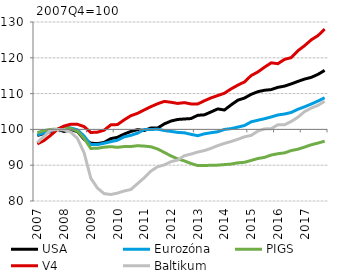
| Category | USA | Eurozóna | PIGS | V4 | Baltikum |
|---|---|---|---|---|---|
| 2007.0 | 98.296 | 98.392 | 99.081 | 95.939 | 96.34 |
| nan | 98.859 | 99.083 | 99.678 | 96.895 | 98.081 |
| nan | 99.396 | 99.501 | 99.994 | 98.356 | 99.793 |
| nan | 100 | 100 | 100.063 | 100 | 100 |
| 2008.0 | 99.425 | 100.726 | 100.748 | 100.945 | 99.835 |
| nan | 99.939 | 100.397 | 100.212 | 101.445 | 99.251 |
| nan | 99.398 | 99.886 | 99.505 | 101.428 | 97.468 |
| nan | 97.247 | 98.131 | 97.465 | 100.775 | 93.475 |
| 2009.0 | 96.155 | 95.757 | 94.685 | 99.133 | 86.37 |
| nan | 96.017 | 95.754 | 94.727 | 99.228 | 83.596 |
| nan | 96.366 | 96.134 | 95.033 | 99.785 | 82.048 |
| nan | 97.425 | 96.573 | 95.185 | 101.266 | 81.821 |
| 2010.0 | 97.8 | 96.975 | 94.987 | 101.352 | 82.211 |
| nan | 98.701 | 97.922 | 95.218 | 102.672 | 82.8 |
| nan | 99.429 | 98.345 | 95.224 | 103.827 | 83.21 |
| nan | 99.928 | 98.949 | 95.449 | 104.484 | 84.856 |
| 2011.0 | 99.688 | 99.958 | 95.337 | 105.452 | 86.483 |
| nan | 100.401 | 99.954 | 95.144 | 106.351 | 88.354 |
| nan | 100.373 | 100.069 | 94.536 | 107.169 | 89.576 |
| nan | 101.536 | 99.693 | 93.564 | 107.814 | 90.075 |
| 2012.0 | 102.331 | 99.44 | 92.59 | 107.586 | 90.987 |
| nan | 102.771 | 99.169 | 91.769 | 107.254 | 91.428 |
| nan | 102.91 | 99.05 | 91.205 | 107.475 | 92.654 |
| nan | 103.027 | 98.622 | 90.472 | 107.116 | 93.108 |
| 2013.0 | 103.94 | 98.241 | 89.89 | 107.1 | 93.672 |
| nan | 104.068 | 98.767 | 89.908 | 107.997 | 94.092 |
| nan | 104.883 | 99.073 | 89.983 | 108.806 | 94.716 |
| nan | 105.721 | 99.347 | 90.021 | 109.451 | 95.474 |
| 2014.0 | 105.422 | 99.991 | 90.168 | 110.108 | 96.088 |
| nan | 106.849 | 100.212 | 90.318 | 111.322 | 96.62 |
| nan | 108.153 | 100.637 | 90.658 | 112.359 | 97.236 |
| nan | 108.762 | 101.083 | 90.81 | 113.263 | 97.932 |
| 2015.0 | 109.794 | 102.113 | 91.327 | 115.042 | 98.318 |
| nan | 110.537 | 102.561 | 91.862 | 116.045 | 99.522 |
| nan | 110.938 | 102.982 | 92.183 | 117.374 | 100.136 |
| nan | 111.116 | 103.477 | 92.844 | 118.592 | 100.2 |
| 2016.0 | 111.745 | 104.038 | 93.208 | 118.358 | 101.315 |
| nan | 112.094 | 104.294 | 93.445 | 119.563 | 101.29 |
| nan | 112.704 | 104.743 | 94.094 | 120.049 | 102.213 |
| nan | 113.413 | 105.623 | 94.466 | 121.981 | 103.411 |
| 2017.0 | 114.055 | 106.314 | 95.063 | 123.395 | 104.982 |
| nan | 114.542 | 107.092 | 95.71 | 125.03 | 105.965 |
| nan | 115.377 | 107.922 | 96.186 | 126.197 | 106.726 |
| nan | 116.479 | 108.853 | 96.71 | 128.005 | 107.85 |